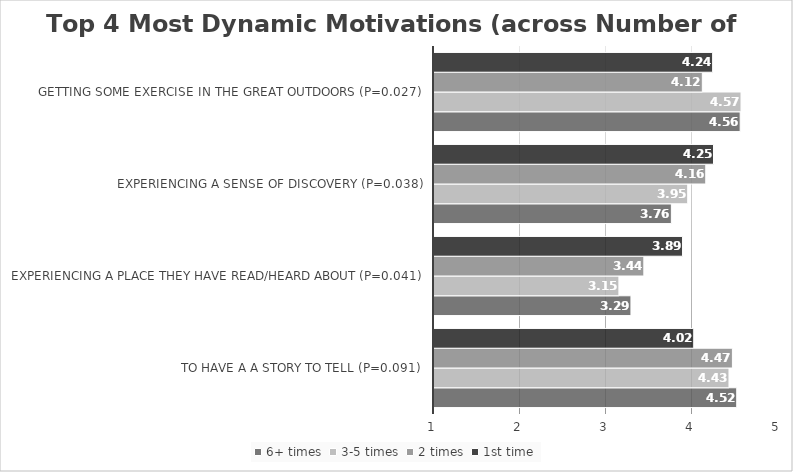
| Category | 6+ times | 3-5 times | 2 times | 1st time |
|---|---|---|---|---|
| To have a a story to tell (P=0.091) | 4.52 | 4.43 | 4.47 | 4.02 |
| Experiencing a place they have read/heard about (P=0.041) | 3.29 | 3.15 | 3.44 | 3.89 |
| Experiencing a sense of discovery (P=0.038) | 3.76 | 3.95 | 4.16 | 4.25 |
| Getting some exercise in the great outdoors (P=0.027) | 4.56 | 4.57 | 4.12 | 4.24 |